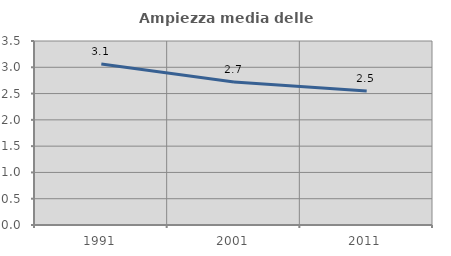
| Category | Ampiezza media delle famiglie |
|---|---|
| 1991.0 | 3.061 |
| 2001.0 | 2.721 |
| 2011.0 | 2.549 |